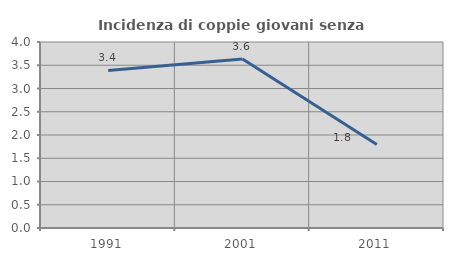
| Category | Incidenza di coppie giovani senza figli |
|---|---|
| 1991.0 | 3.389 |
| 2001.0 | 3.634 |
| 2011.0 | 1.794 |